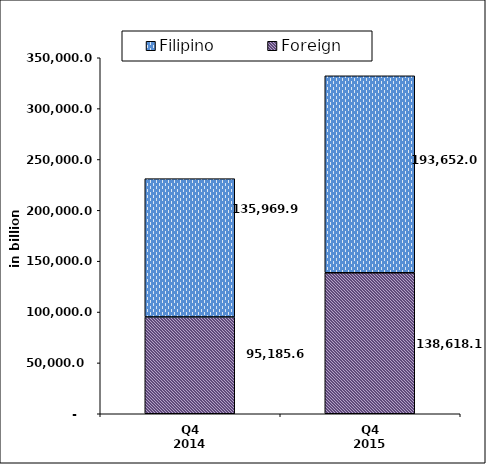
| Category | Foreign | Filipino |
|---|---|---|
| Q4 2014 | 95185.609 | 135969.926 |
| Q4 2015 | 138618.052 | 193652.009 |